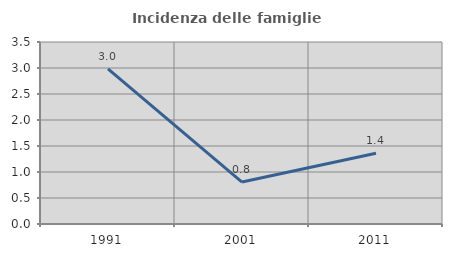
| Category | Incidenza delle famiglie numerose |
|---|---|
| 1991.0 | 2.985 |
| 2001.0 | 0.806 |
| 2011.0 | 1.361 |